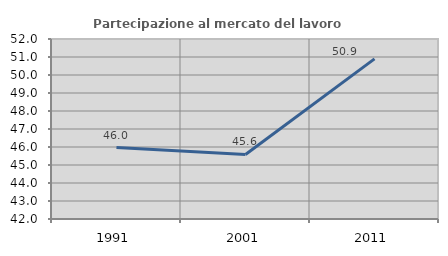
| Category | Partecipazione al mercato del lavoro  femminile |
|---|---|
| 1991.0 | 45.969 |
| 2001.0 | 45.587 |
| 2011.0 | 50.896 |